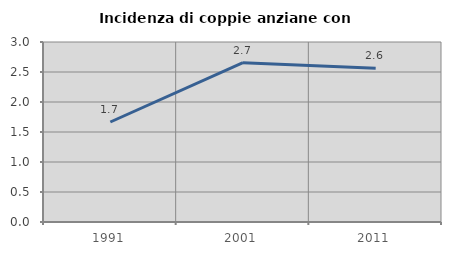
| Category | Incidenza di coppie anziane con figli |
|---|---|
| 1991.0 | 1.667 |
| 2001.0 | 2.655 |
| 2011.0 | 2.564 |